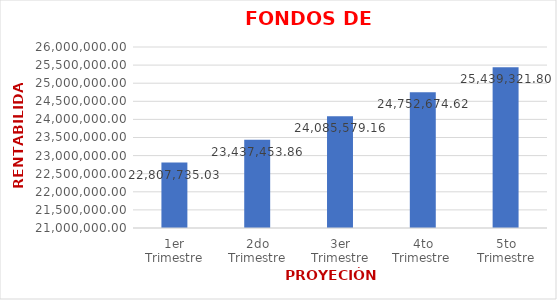
| Category | FONDOS DE INVERSIÓN |
|---|---|
| 1er Trimestre | 22807735.031 |
| 2do Trimestre | 23437453.862 |
| 3er Trimestre | 24085579.162 |
| 4to Trimestre  | 24752674.62 |
| 5to Trimestre | 25439321.798 |